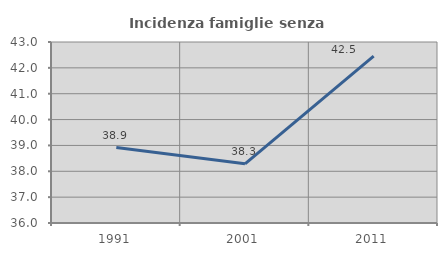
| Category | Incidenza famiglie senza nuclei |
|---|---|
| 1991.0 | 38.919 |
| 2001.0 | 38.288 |
| 2011.0 | 42.456 |